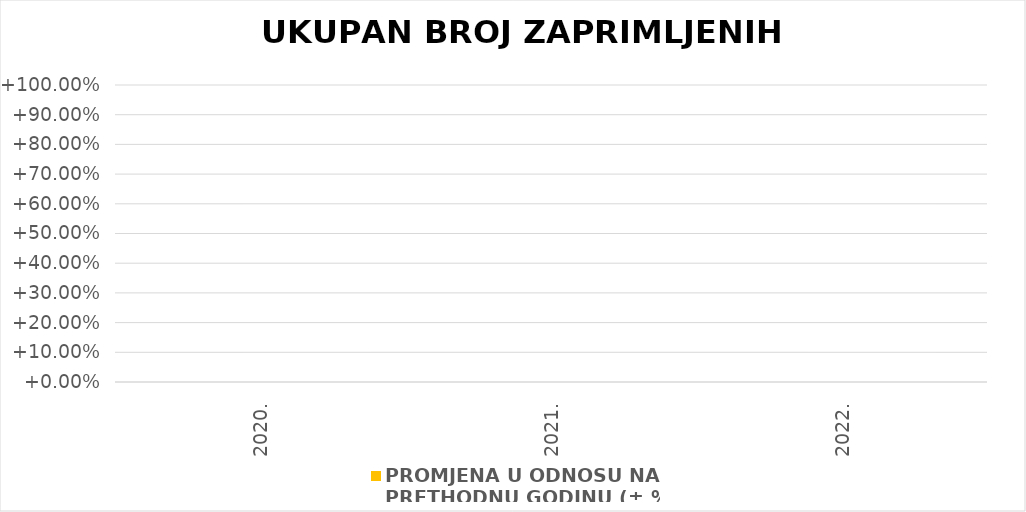
| Category | PROMJENA U ODNOSU NA 
PRETHODNU GODINU (± %) |
|---|---|
| 2020. | 0 |
| 2021. | 0 |
| 2022. | 0 |